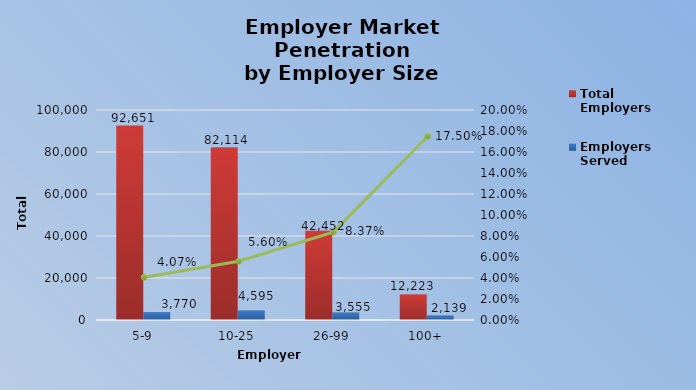
| Category | Total Employers | Employers Served |
|---|---|---|
| 5-9 | 92651 | 3770 |
| 10-25 | 82114 | 4595 |
| 26-99 | 42452 | 3555 |
| 100+ | 12223 | 2139 |